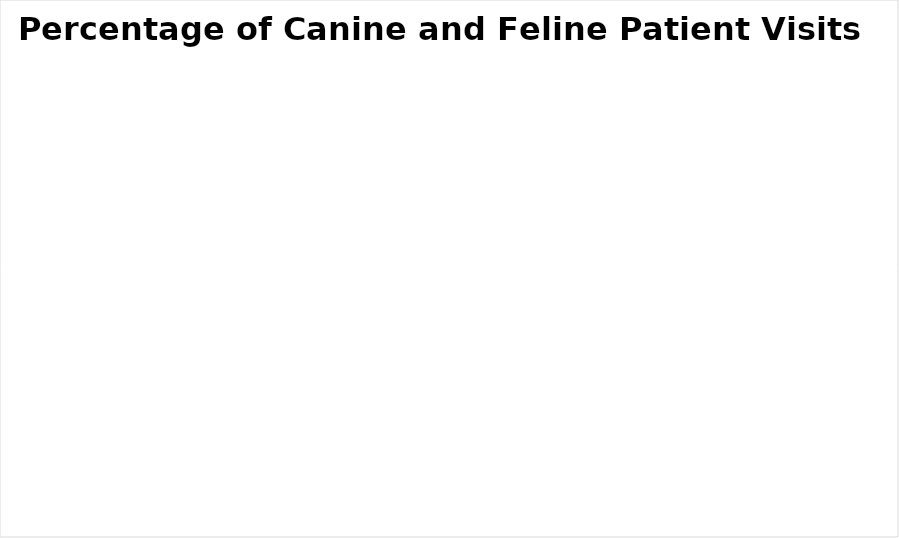
| Category | Series 0 |
|---|---|
| Canine | 0 |
| Feline | 0 |